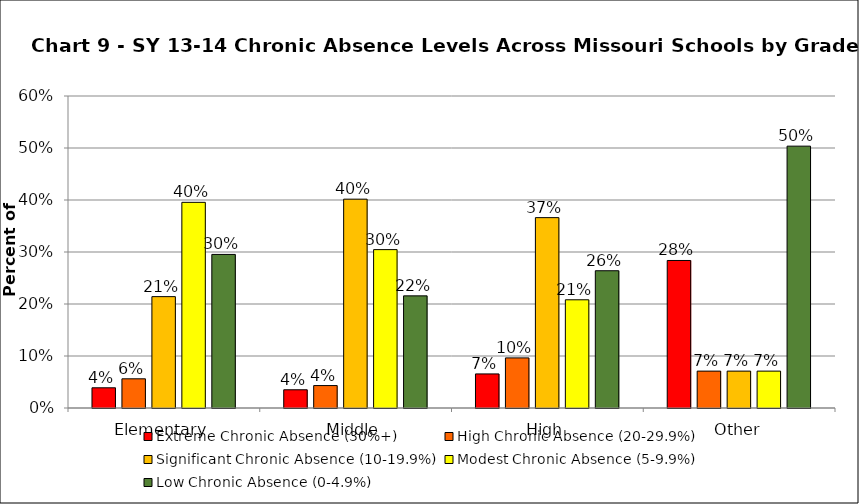
| Category | Extreme Chronic Absence (30%+) | High Chronic Absence (20-29.9%) | Significant Chronic Absence (10-19.9%) | Modest Chronic Absence (5-9.9%) | Low Chronic Absence (0-4.9%) |
|---|---|---|---|---|---|
| 0 | 0.039 | 0.056 | 0.214 | 0.396 | 0.295 |
| 1 | 0.035 | 0.043 | 0.402 | 0.305 | 0.216 |
| 2 | 0.066 | 0.096 | 0.366 | 0.208 | 0.264 |
| 3 | 0.284 | 0.071 | 0.071 | 0.071 | 0.504 |